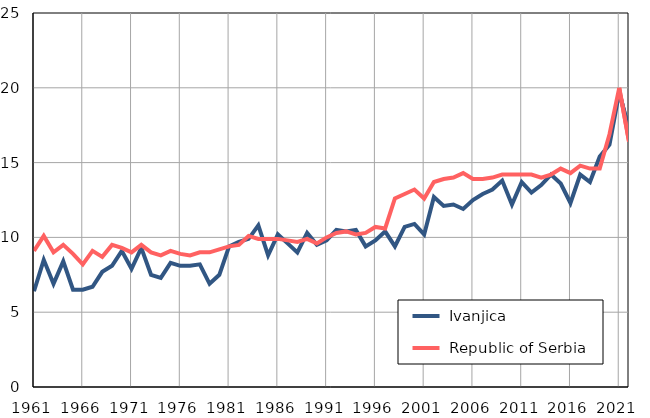
| Category |  Ivanjica |  Republic of Serbia |
|---|---|---|
| 1961.0 | 6.4 | 9.1 |
| 1962.0 | 8.5 | 10.1 |
| 1963.0 | 6.9 | 9 |
| 1964.0 | 8.4 | 9.5 |
| 1965.0 | 6.5 | 8.9 |
| 1966.0 | 6.5 | 8.2 |
| 1967.0 | 6.7 | 9.1 |
| 1968.0 | 7.7 | 8.7 |
| 1969.0 | 8.1 | 9.5 |
| 1970.0 | 9.1 | 9.3 |
| 1971.0 | 7.9 | 9 |
| 1972.0 | 9.3 | 9.5 |
| 1973.0 | 7.5 | 9 |
| 1974.0 | 7.3 | 8.8 |
| 1975.0 | 8.3 | 9.1 |
| 1976.0 | 8.1 | 8.9 |
| 1977.0 | 8.1 | 8.8 |
| 1978.0 | 8.2 | 9 |
| 1979.0 | 6.9 | 9 |
| 1980.0 | 7.5 | 9.2 |
| 1981.0 | 9.4 | 9.4 |
| 1982.0 | 9.7 | 9.5 |
| 1983.0 | 9.9 | 10.1 |
| 1984.0 | 10.8 | 9.9 |
| 1985.0 | 8.8 | 9.9 |
| 1986.0 | 10.2 | 9.9 |
| 1987.0 | 9.6 | 9.8 |
| 1988.0 | 9 | 9.7 |
| 1989.0 | 10.3 | 9.9 |
| 1990.0 | 9.5 | 9.6 |
| 1991.0 | 9.8 | 10 |
| 1992.0 | 10.5 | 10.3 |
| 1993.0 | 10.4 | 10.4 |
| 1994.0 | 10.5 | 10.2 |
| 1995.0 | 9.4 | 10.3 |
| 1996.0 | 9.8 | 10.7 |
| 1997.0 | 10.4 | 10.6 |
| 1998.0 | 9.4 | 12.6 |
| 1999.0 | 10.7 | 12.9 |
| 2000.0 | 10.9 | 13.2 |
| 2001.0 | 10.2 | 12.6 |
| 2002.0 | 12.7 | 13.7 |
| 2003.0 | 12.1 | 13.9 |
| 2004.0 | 12.2 | 14 |
| 2005.0 | 11.9 | 14.3 |
| 2006.0 | 12.5 | 13.9 |
| 2007.0 | 12.9 | 13.9 |
| 2008.0 | 13.2 | 14 |
| 2009.0 | 13.8 | 14.2 |
| 2010.0 | 12.2 | 14.2 |
| 2011.0 | 13.7 | 14.2 |
| 2012.0 | 13 | 14.2 |
| 2013.0 | 13.5 | 14 |
| 2014.0 | 14.2 | 14.2 |
| 2015.0 | 13.6 | 14.6 |
| 2016.0 | 12.3 | 14.3 |
| 2017.0 | 14.2 | 14.8 |
| 2018.0 | 13.7 | 14.6 |
| 2019.0 | 15.4 | 14.6 |
| 2020.0 | 16.2 | 16.9 |
| 2021.0 | 19.7 | 20 |
| 2022.0 | 17.2 | 16.4 |